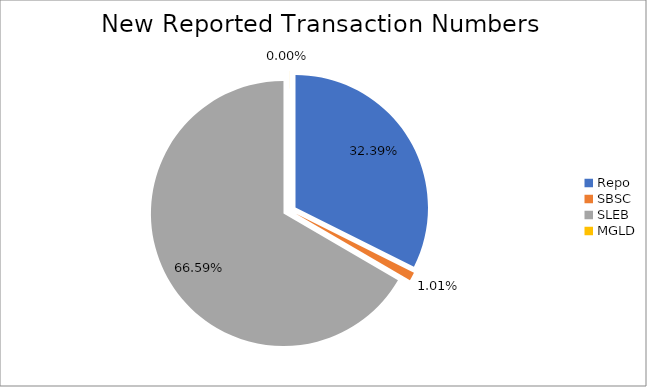
| Category | Series 0 |
|---|---|
| Repo | 344340 |
| SBSC | 10724 |
| SLEB | 707871 |
| MGLD | 40 |